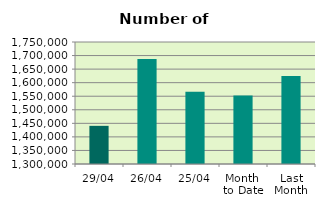
| Category | Series 0 |
|---|---|
| 29/04 | 1440748 |
| 26/04 | 1686930 |
| 25/04 | 1566916 |
| Month 
to Date | 1552660.105 |
| Last
Month | 1624932.286 |